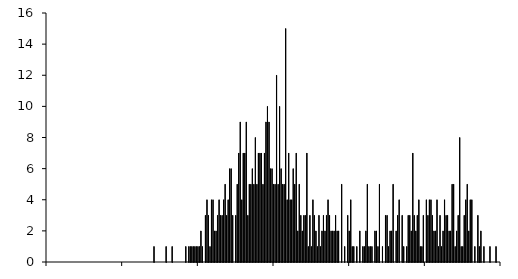
| Category | Series 0 |
|---|---|
| -1.50_-1.49 | 0 |
| -1.49_-1.48 | 0 |
| -1.48_-1.47 | 0 |
| -1.47_-1.46 | 0 |
| -1.46_-1.45 | 0 |
| -1.45_-1.44 | 0 |
| -1.44_-1.43 | 0 |
| -1.43_-1.42 | 0 |
| -1.42_-1.41 | 0 |
| -1.41_-1.40 | 0 |
| -1.40_-1.39 | 0 |
| -1.39_-1.38 | 0 |
| -1.38_-1.37 | 0 |
| -1.37_-1.36 | 0 |
| -1.36_-1.35 | 0 |
| -1.35_-1.34 | 0 |
| -1.34_-1.33 | 0 |
| -1.33_-1.32 | 0 |
| -1.32_-1.31 | 0 |
| -1.31_-1.30 | 0 |
| -1.30_-1.29 | 0 |
| -1.29_-1.28 | 0 |
| -1.28_-1.27 | 0 |
| -1.27_-1.26 | 0 |
| -1.26_-1.25 | 0 |
| -1.25_-1.24 | 0 |
| -1.24_-1.23 | 0 |
| -1.23_-1.22 | 0 |
| -1.22_-1.21 | 0 |
| -1.21_-1.20 | 0 |
| -1.20_-1.19 | 0 |
| -1.19_-1.18 | 0 |
| -1.18_-1.17 | 0 |
| -1.17_-1.16 | 0 |
| -1.16_-1.15 | 0 |
| -1.15_-1.14 | 0 |
| -1.14_-1.13 | 0 |
| -1.13_-1.12 | 0 |
| -1.12_-1.11 | 0 |
| -1.11_-1.10 | 0 |
| -1.10_-1.09 | 0 |
| -1.09_-1.08 | 0 |
| -1.08_-1.07 | 0 |
| -1.07_-1.06 | 0 |
| -1.06_-1.05 | 0 |
| -1.05_-1.04 | 0 |
| -1.04_-1.03 | 0 |
| -1.03_-1.02 | 0 |
| -1.02_-1.01 | 0 |
| -1.01_-1.00 | 0 |
| -1.00_-0.99 | 0 |
| -0.99_-0.98 | 0 |
| -0.98_-0.97 | 0 |
| -0.97_-0.96 | 0 |
| -0.96_-0.95 | 0 |
| -0.95_-0.94 | 0 |
| -0.94_-0.93 | 0 |
| -0.93_-0.92 | 0 |
| -0.92_-0.91 | 0 |
| -0.91_-0.90 | 0 |
| -0.90_-0.89 | 0 |
| -0.89_-0.88 | 0 |
| -0.88_-0.87 | 0 |
| -0.87_-0.86 | 0 |
| -0.86_-0.85 | 0 |
| -0.85_-0.84 | 0 |
| -0.84_-0.83 | 0 |
| -0.83_-0.82 | 0 |
| -0.82_-0.81 | 0 |
| -0.81_-0.80 | 0 |
| -0.80_-0.79 | 0 |
| -0.79_-0.78 | 1 |
| -0.78_-0.77 | 0 |
| -0.77_-0.76 | 0 |
| -0.76_-0.75 | 0 |
| -0.75_-0.74 | 0 |
| -0.74_-0.73 | 0 |
| -0.73_-0.72 | 0 |
| -0.72_-0.71 | 0 |
| -0.71_-0.70 | 1 |
| -0.70_-0.69 | 0 |
| -0.69_-0.68 | 0 |
| -0.68_-0.67 | 0 |
| -0.67_-0.66 | 1 |
| -0.66_-0.65 | 0 |
| -0.65_-0.64 | 0 |
| -0.64_-0.63 | 0 |
| -0.63_-0.62 | 0 |
| -0.62_-0.61 | 0 |
| -0.61_-0.60 | 0 |
| -0.60_-0.59 | 0 |
| -0.59_-0.58 | 0 |
| -0.58_-0.57 | 1 |
| -0.57_-0.56 | 0 |
| -0.56_-0.55 | 1 |
| -0.55_-0.54 | 1 |
| -0.54_-0.53 | 1 |
| -0.53_-0.52 | 1 |
| -0.52_-0.51 | 1 |
| -0.51_-0.50 | 1 |
| -0.50_-0.49 | 1 |
| -0.49_-0.48 | 1 |
| -0.48_-0.47 | 2 |
| -0.47_-0.46 | 1 |
| -0.46_-0.45 | 0 |
| -0.45_-0.44 | 3 |
| -0.44_-0.43 | 4 |
| -0.43_-0.42 | 3 |
| -0.42_-0.41 | 1 |
| -0.41_-0.40 | 4 |
| -0.40_-0.39 | 4 |
| -0.39_-0.38 | 2 |
| -0.38_-0.37 | 2 |
| -0.37_-0.36 | 3 |
| -0.36_-0.35 | 4 |
| -0.35_-0.34 | 3 |
| -0.34_-0.33 | 3 |
| -0.33_-0.32 | 4 |
| -0.32_-0.31 | 5 |
| -0.31_-0.30 | 3 |
| -0.30_-0.29 | 4 |
| -0.29_-0.28 | 6 |
| -0.28_-0.27 | 6 |
| -0.27_-0.26 | 3 |
| -0.26_-0.25 | 0 |
| -0.25_-0.24 | 3 |
| -0.24_-0.23 | 5 |
| -0.23_-0.22 | 7 |
| -0.22_-0.21 | 9 |
| -0.21_-0.20 | 4 |
| -0.20_-0.19 | 7 |
| -0.19_-0.18 | 7 |
| -0.18_-0.17 | 9 |
| -0.17_-0.16 | 3 |
| -0.16_-0.15 | 5 |
| -0.15_-0.14 | 5 |
| -0.14_-0.13 | 6 |
| -0.13_-0.12 | 5 |
| -0.12_-0.11 | 8 |
| -0.11_-0.10 | 5 |
| -0.10_-0.09 | 7 |
| -0.09_-0.08 | 7 |
| -0.08_-0.07 | 7 |
| -0.07_-0.06 | 5 |
| -0.06_-0.05 | 7 |
| -0.05_-0.04 | 9 |
| -0.04_-0.03 | 10 |
| -0.03_-0.02 | 9 |
| -0.02_-0.01 | 6 |
| -0.01_0.00 | 6 |
| 0.00_0.01 | 5 |
| 0.01_0.02 | 5 |
| 0.02_0.03 | 12 |
| 0.03_0.04 | 5 |
| 0.04_0.05 | 10 |
| 0.05_0.06 | 6 |
| 0.06_0.07 | 5 |
| 0.07_0.08 | 5 |
| 0.08_0.09 | 15 |
| 0.09_0.10 | 4 |
| 0.10_0.11 | 7 |
| 0.11_0.12 | 4 |
| 0.12_0.13 | 4 |
| 0.13_0.14 | 6 |
| 0.14_0.15 | 5 |
| 0.15_0.16 | 7 |
| 0.16_0.17 | 2 |
| 0.17_0.18 | 5 |
| 0.18_0.19 | 3 |
| 0.19_0.20 | 2 |
| 0.20_0.21 | 3 |
| 0.21_0.22 | 3 |
| 0.22_0.23 | 7 |
| 0.23_0.24 | 1 |
| 0.24_0.25 | 3 |
| 0.25_0.26 | 1 |
| 0.26_0.27 | 4 |
| 0.27_0.28 | 3 |
| 0.28_0.29 | 2 |
| 0.29_0.30 | 1 |
| 0.30_0.31 | 3 |
| 0.31_0.32 | 1 |
| 0.32_0.33 | 2 |
| 0.33_0.34 | 3 |
| 0.34_0.35 | 2 |
| 0.35_0.36 | 3 |
| 0.36_0.37 | 4 |
| 0.37_0.38 | 3 |
| 0.38_0.39 | 2 |
| 0.39_0.40 | 2 |
| 0.40_0.41 | 2 |
| 0.41_0.42 | 3 |
| 0.42_0.43 | 2 |
| 0.43_0.44 | 2 |
| 0.44_0.45 | 0 |
| 0.45_0.46 | 5 |
| 0.46_0.47 | 0 |
| 0.47_0.48 | 1 |
| 0.48_0.49 | 0 |
| 0.49_0.50 | 3 |
| 0.50_0.51 | 2 |
| 0.51_0.52 | 4 |
| 0.52_0.53 | 1 |
| 0.53_0.54 | 1 |
| 0.54_0.55 | 0 |
| 0.55_0.56 | 1 |
| 0.56_0.57 | 0 |
| 0.57_0.58 | 2 |
| 0.58_0.59 | 0 |
| 0.59_0.60 | 1 |
| 0.60_0.61 | 1 |
| 0.61_0.62 | 2 |
| 0.62_0.63 | 5 |
| 0.63_0.64 | 1 |
| 0.64_0.65 | 1 |
| 0.65_0.66 | 1 |
| 0.66_0.67 | 0 |
| 0.67_0.68 | 2 |
| 0.68_0.69 | 2 |
| 0.69_0.70 | 1 |
| 0.70_0.71 | 5 |
| 0.71_0.72 | 0 |
| 0.72_0.73 | 1 |
| 0.73_0.74 | 0 |
| 0.74_0.75 | 3 |
| 0.75_0.76 | 3 |
| 0.76_0.77 | 1 |
| 0.77_0.78 | 2 |
| 0.78_0.79 | 2 |
| 0.79_0.80 | 5 |
| 0.80_0.81 | 0 |
| 0.81_0.82 | 2 |
| 0.82_0.83 | 3 |
| 0.83_0.84 | 4 |
| 0.84_0.85 | 0 |
| 0.85_0.86 | 3 |
| 0.86_0.87 | 1 |
| 0.87_0.88 | 0 |
| 0.88_0.89 | 1 |
| 0.89_0.90 | 3 |
| 0.90_0.91 | 3 |
| 0.91_0.92 | 2 |
| 0.92_0.93 | 7 |
| 0.93_0.94 | 3 |
| 0.94_0.95 | 2 |
| 0.95_0.96 | 3 |
| 0.96_0.97 | 4 |
| 0.97_0.98 | 1 |
| 0.98_0.99 | 1 |
| 0.99_1.00 | 3 |
| 1.00_1.01 | 0 |
| 1.01_1.02 | 4 |
| 1.02_1.03 | 3 |
| 1.03_1.04 | 4 |
| 1.04_1.05 | 4 |
| 1.05_1.06 | 3 |
| 1.06_1.07 | 2 |
| 1.07_1.08 | 2 |
| 1.08_1.09 | 4 |
| 1.09_1.10 | 1 |
| 1.10_1.11 | 3 |
| 1.11_1.12 | 1 |
| 1.12_1.13 | 2 |
| 1.13_1.14 | 4 |
| 1.14_1.15 | 3 |
| 1.15_1.16 | 3 |
| 1.16_1.17 | 2 |
| 1.17_1.18 | 2 |
| 1.18_1.19 | 5 |
| 1.19_1.20 | 5 |
| 1.20_1.21 | 1 |
| 1.21_1.22 | 2 |
| 1.22_1.23 | 3 |
| 1.23_1.24 | 8 |
| 1.24_1.25 | 1 |
| 1.25_1.26 | 1 |
| 1.26_1.27 | 3 |
| 1.27_1.28 | 4 |
| 1.28_1.29 | 5 |
| 1.29_1.30 | 2 |
| 1.30_1.31 | 4 |
| 1.31_1.32 | 4 |
| 1.32_1.33 | 0 |
| 1.33_1.34 | 1 |
| 1.34_1.35 | 0 |
| 1.35_1.36 | 3 |
| 1.36_1.37 | 1 |
| 1.37_1.38 | 2 |
| 1.38_1.39 | 0 |
| 1.39_1.40 | 1 |
| 1.40_1.41 | 0 |
| 1.41_1.42 | 0 |
| 1.42_1.43 | 0 |
| 1.43_1.44 | 1 |
| 1.44_1.45 | 0 |
| 1.45_1.46 | 0 |
| 1.46_1.47 | 0 |
| 1.47_1.48 | 1 |
| 1.48_1.49 | 0 |
| 1.49_1.50 | 0 |